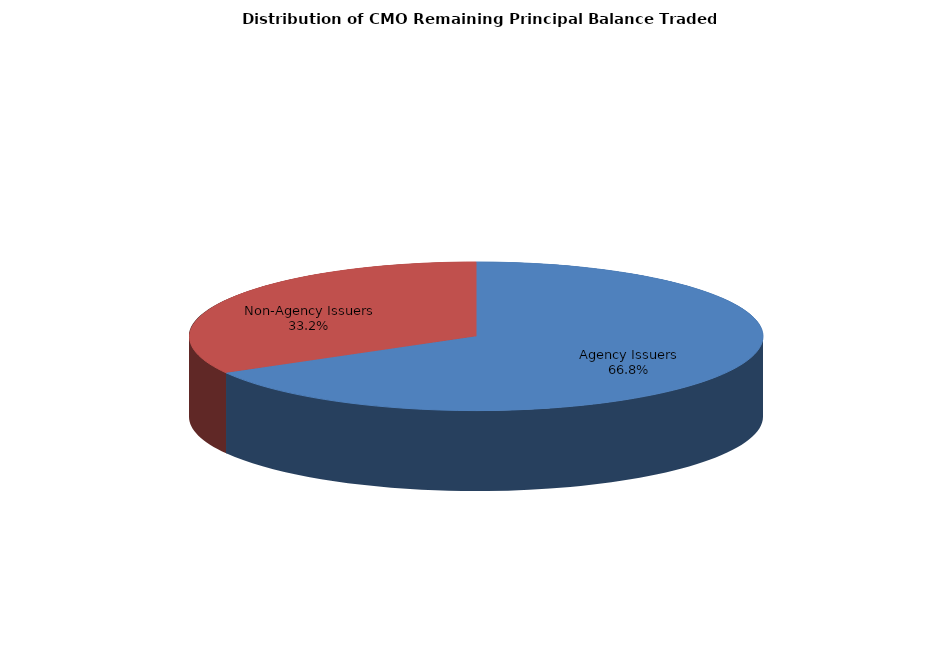
| Category | Series 0 |
|---|---|
| Agency Issuers | 4750032352.192 |
| Non-Agency Issuers | 2359823405.55 |